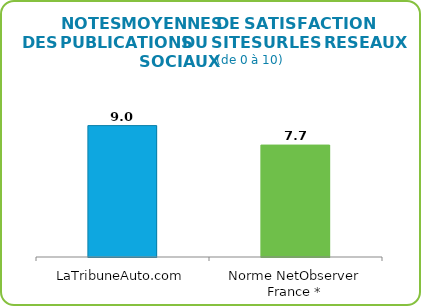
| Category | Publications du site sur les réseaux sociaux |
|---|---|
| LaTribuneAuto.com | 9 |
| Norme NetObserver France * | 7.666 |